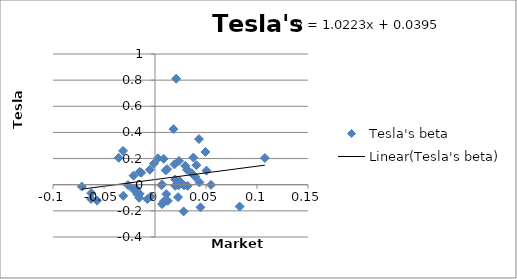
| Category | Tesla's beta |
|---|---|
| 0.011873817294504763 | 0.119 |
| 0.08298311776039413 | -0.167 |
| -0.026442831573227132 | -0.003 |
| -0.06258081816720285 | -0.064 |
| 0.019742029696721453 | -0.008 |
| -0.021011672375900514 | 0.07 |
| 0.010491382393316817 | 0.109 |
| 0.008520819730124751 | 0.197 |
| -0.01739610691375626 | -0.072 |
| 0.054892511014553946 | -0.001 |
| -0.031040805790470194 | -0.085 |
| -0.004188587877920424 | -0.09 |
| 0.02453358876036482 | 0.012 |
| 0.02320146078677232 | -0.004 |
| -0.015513837223063764 | -0.1 |
| 0.03765529548973512 | 0.208 |
| -0.015079830581919862 | -0.07 |
| 0.01905833165892057 | 0.155 |
| 0.021030280012996005 | -0.001 |
| 0.006200788965052828 | -0.003 |
| 0.006932165607935747 | -0.149 |
| 0.04311702997659528 | 0.349 |
| -0.035582905675162646 | 0.206 |
| 0.02356279155049279 | 0.182 |
| 0.02804947163518645 | -0.204 |
| 0.04459575261800608 | -0.173 |
| 0.029749523177239112 | 0.144 |
| -0.031298019033866864 | 0.259 |
| 0.04946207981522499 | 0.251 |
| -0.014999301636062778 | 0.098 |
| 0.020762811721046104 | 0.811 |
| 0.01808576785925231 | 0.425 |
| 0.035987723516956116 | 0.088 |
| 0.011060649195259176 | -0.071 |
| 0.05042809651957847 | 0.107 |
| 0.007068230463864511 | 0.001 |
| 0.002846717017343403 | 0.202 |
| -0.019789409878227415 | -0.039 |
| 0.024236153696477025 | 0.027 |
| 0.019763369680148246 | 0.04 |
| 0.012597574126154365 | -0.124 |
| 0.03955498213459152 | 0.061 |
| -0.06265072563317764 | -0.11 |
| -0.00749745270927038 | -0.11 |
| 0.03133231453053065 | 0.115 |
| 0.040589464130841746 | 0.149 |
| 0.043583062218506274 | 0.018 |
| 0.008532763948144062 | -0.128 |
| -0.005058715193587249 | 0.115 |
| 0.10772303853581011 | 0.204 |
| -0.07176198830376013 | -0.014 |
| -0.05679110746359761 | -0.122 |
| -0.021474425791952023 | -0.033 |
| -0.01825746126569705 | -0.034 |
| -0.01350095276693064 | 0.092 |
| 0.02849538044379507 | -0.005 |
| -0.0010473132038185673 | 0.162 |
| 0.03195656405295222 | -0.009 |
| 0.02264557398008682 | -0.095 |